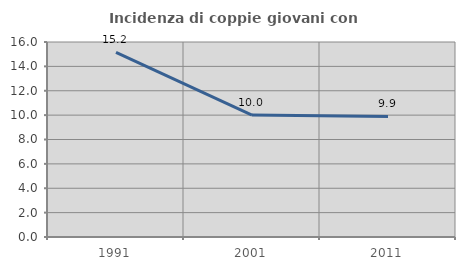
| Category | Incidenza di coppie giovani con figli |
|---|---|
| 1991.0 | 15.15 |
| 2001.0 | 10.007 |
| 2011.0 | 9.894 |